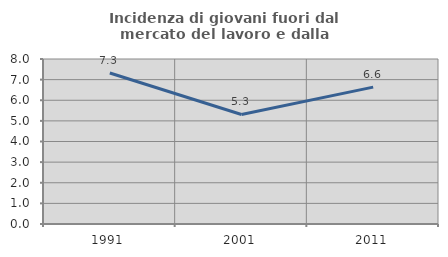
| Category | Incidenza di giovani fuori dal mercato del lavoro e dalla formazione  |
|---|---|
| 1991.0 | 7.323 |
| 2001.0 | 5.31 |
| 2011.0 | 6.637 |